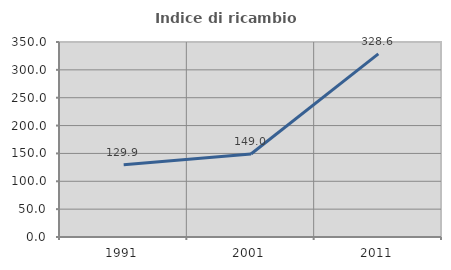
| Category | Indice di ricambio occupazionale  |
|---|---|
| 1991.0 | 129.851 |
| 2001.0 | 149.02 |
| 2011.0 | 328.571 |